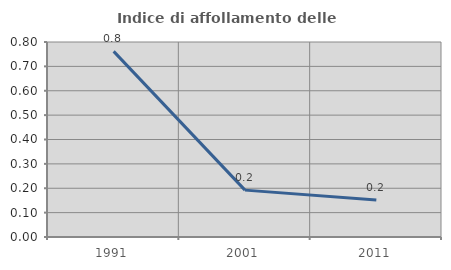
| Category | Indice di affollamento delle abitazioni  |
|---|---|
| 1991.0 | 0.761 |
| 2001.0 | 0.192 |
| 2011.0 | 0.152 |